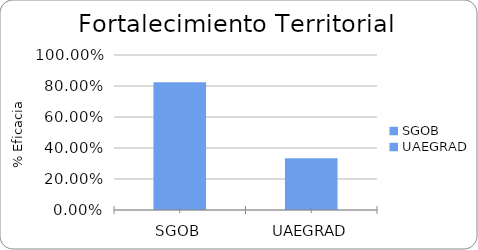
| Category | % Eficacia total |
|---|---|
| SGOB | 0.824 |
| UAEGRAD | 0.333 |